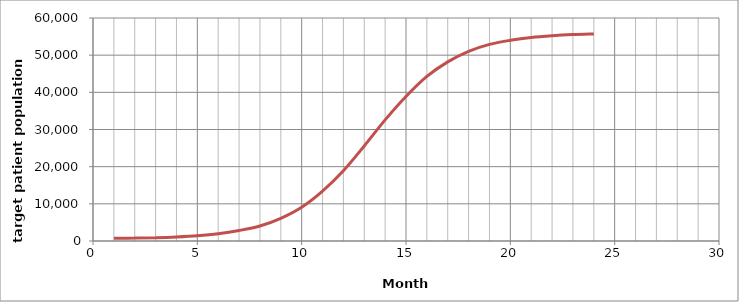
| Category | Series 1 |
|---|---|
| 0 | 712509.951 |
| 1 | 787032.405 |
| 2 | 905601.748 |
| 3 | 1106848.613 |
| 4 | 1425135.712 |
| 5 | 1960063.722 |
| 6 | 2827625.554 |
| 7 | 4048637.344 |
| 8 | 6112562.068 |
| 9 | 9088223.275 |
| 10 | 13423726.994 |
| 11 | 18898365.148 |
| 12 | 25576769.924 |
| 13 | 32590928.596 |
| 14 | 38889453.347 |
| 15 | 44275147.447 |
| 16 | 48196716.547 |
| 17 | 51032902.931 |
| 18 | 52905272.321 |
| 19 | 54005790.092 |
| 20 | 54784524.845 |
| 21 | 55251315.545 |
| 22 | 55547793.558 |
| 23 | 55722957.514 |
| 24 | 0 |
| 25 | 0 |
| 26 | 0 |
| 27 | 0 |
| 28 | 0 |
| 29 | 0 |
| 30 | 0 |
| 31 | 0 |
| 32 | 0 |
| 33 | 0 |
| 34 | 0 |
| 35 | 0 |
| 36 | 0 |
| 37 | 0 |
| 38 | 0 |
| 39 | 0 |
| 40 | 0 |
| 41 | 0 |
| 42 | 0 |
| 43 | 0 |
| 44 | 0 |
| 45 | 0 |
| 46 | 0 |
| 47 | 0 |
| 48 | 0 |
| 49 | 0 |
| 50 | 0 |
| 51 | 0 |
| 52 | 0 |
| 53 | 0 |
| 54 | 0 |
| 55 | 0 |
| 56 | 0 |
| 57 | 0 |
| 58 | 0 |
| 59 | 0 |
| 60 | 0 |
| 61 | 0 |
| 62 | 0 |
| 63 | 0 |
| 64 | 0 |
| 65 | 0 |
| 66 | 0 |
| 67 | 0 |
| 68 | 0 |
| 69 | 0 |
| 70 | 0 |
| 71 | 0 |
| 72 | 0 |
| 73 | 0 |
| 74 | 0 |
| 75 | 0 |
| 76 | 0 |
| 77 | 0 |
| 78 | 0 |
| 79 | 0 |
| 80 | 0 |
| 81 | 0 |
| 82 | 0 |
| 83 | 0 |
| 84 | 0 |
| 85 | 0 |
| 86 | 0 |
| 87 | 0 |
| 88 | 0 |
| 89 | 0 |
| 90 | 0 |
| 91 | 0 |
| 92 | 0 |
| 93 | 0 |
| 94 | 0 |
| 95 | 0 |
| 96 | 0 |
| 97 | 0 |
| 98 | 0 |
| 99 | 0 |
| 100 | 0 |
| 101 | 0 |
| 102 | 0 |
| 103 | 0 |
| 104 | 0 |
| 105 | 0 |
| 106 | 0 |
| 107 | 0 |
| 108 | 0 |
| 109 | 0 |
| 110 | 0 |
| 111 | 0 |
| 112 | 0 |
| 113 | 0 |
| 114 | 0 |
| 115 | 0 |
| 116 | 0 |
| 117 | 0 |
| 118 | 0 |
| 119 | 0 |
| 120 | 0 |
| 121 | 0 |
| 122 | 0 |
| 123 | 0 |
| 124 | 0 |
| 125 | 0 |
| 126 | 0 |
| 127 | 0 |
| 128 | 0 |
| 129 | 0 |
| 130 | 0 |
| 131 | 0 |
| 132 | 0 |
| 133 | 0 |
| 134 | 0 |
| 135 | 0 |
| 136 | 0 |
| 137 | 0 |
| 138 | 0 |
| 139 | 0 |
| 140 | 0 |
| 141 | 0 |
| 142 | 0 |
| 143 | 0 |
| 144 | 0 |
| 145 | 0 |
| 146 | 0 |
| 147 | 0 |
| 148 | 0 |
| 149 | 0 |
| 150 | 0 |
| 151 | 0 |
| 152 | 0 |
| 153 | 0 |
| 154 | 0 |
| 155 | 0 |
| 156 | 0 |
| 157 | 0 |
| 158 | 0 |
| 159 | 0 |
| 160 | 0 |
| 161 | 0 |
| 162 | 0 |
| 163 | 0 |
| 164 | 0 |
| 165 | 0 |
| 166 | 0 |
| 167 | 0 |
| 168 | 0 |
| 169 | 0 |
| 170 | 0 |
| 171 | 0 |
| 172 | 0 |
| 173 | 0 |
| 174 | 0 |
| 175 | 0 |
| 176 | 0 |
| 177 | 0 |
| 178 | 0 |
| 179 | 0 |
| 180 | 0 |
| 181 | 0 |
| 182 | 0 |
| 183 | 0 |
| 184 | 0 |
| 185 | 0 |
| 186 | 0 |
| 187 | 0 |
| 188 | 0 |
| 189 | 0 |
| 190 | 0 |
| 191 | 0 |
| 192 | 0 |
| 193 | 0 |
| 194 | 0 |
| 195 | 0 |
| 196 | 0 |
| 197 | 0 |
| 198 | 0 |
| 199 | 0 |
| 200 | 0 |
| 201 | 0 |
| 202 | 0 |
| 203 | 0 |
| 204 | 0 |
| 205 | 0 |
| 206 | 0 |
| 207 | 0 |
| 208 | 0 |
| 209 | 0 |
| 210 | 0 |
| 211 | 0 |
| 212 | 0 |
| 213 | 0 |
| 214 | 0 |
| 215 | 0 |
| 216 | 0 |
| 217 | 0 |
| 218 | 0 |
| 219 | 0 |
| 220 | 0 |
| 221 | 0 |
| 222 | 0 |
| 223 | 0 |
| 224 | 0 |
| 225 | 0 |
| 226 | 0 |
| 227 | 0 |
| 228 | 0 |
| 229 | 0 |
| 230 | 0 |
| 231 | 0 |
| 232 | 0 |
| 233 | 0 |
| 234 | 0 |
| 235 | 0 |
| 236 | 0 |
| 237 | 0 |
| 238 | 0 |
| 239 | 0 |
| 240 | 0 |
| 241 | 0 |
| 242 | 0 |
| 243 | 0 |
| 244 | 0 |
| 245 | 0 |
| 246 | 0 |
| 247 | 0 |
| 248 | 0 |
| 249 | 0 |
| 250 | 0 |
| 251 | 0 |
| 252 | 0 |
| 253 | 0 |
| 254 | 0 |
| 255 | 0 |
| 256 | 0 |
| 257 | 0 |
| 258 | 0 |
| 259 | 0 |
| 260 | 0 |
| 261 | 0 |
| 262 | 0 |
| 263 | 0 |
| 264 | 0 |
| 265 | 0 |
| 266 | 0 |
| 267 | 0 |
| 268 | 0 |
| 269 | 0 |
| 270 | 0 |
| 271 | 0 |
| 272 | 0 |
| 273 | 0 |
| 274 | 0 |
| 275 | 0 |
| 276 | 0 |
| 277 | 0 |
| 278 | 0 |
| 279 | 0 |
| 280 | 0 |
| 281 | 0 |
| 282 | 0 |
| 283 | 0 |
| 284 | 0 |
| 285 | 0 |
| 286 | 0 |
| 287 | 0 |
| 288 | 0 |
| 289 | 0 |
| 290 | 0 |
| 291 | 0 |
| 292 | 0 |
| 293 | 0 |
| 294 | 0 |
| 295 | 0 |
| 296 | 0 |
| 297 | 0 |
| 298 | 0 |
| 299 | 0 |
| 300 | 0 |
| 301 | 0 |
| 302 | 0 |
| 303 | 0 |
| 304 | 0 |
| 305 | 0 |
| 306 | 0 |
| 307 | 0 |
| 308 | 0 |
| 309 | 0 |
| 310 | 0 |
| 311 | 0 |
| 312 | 0 |
| 313 | 0 |
| 314 | 0 |
| 315 | 0 |
| 316 | 0 |
| 317 | 0 |
| 318 | 0 |
| 319 | 0 |
| 320 | 0 |
| 321 | 0 |
| 322 | 0 |
| 323 | 0 |
| 324 | 0 |
| 325 | 0 |
| 326 | 0 |
| 327 | 0 |
| 328 | 0 |
| 329 | 0 |
| 330 | 0 |
| 331 | 0 |
| 332 | 0 |
| 333 | 0 |
| 334 | 0 |
| 335 | 0 |
| 336 | 0 |
| 337 | 0 |
| 338 | 0 |
| 339 | 0 |
| 340 | 0 |
| 341 | 0 |
| 342 | 0 |
| 343 | 0 |
| 344 | 0 |
| 345 | 0 |
| 346 | 0 |
| 347 | 0 |
| 348 | 0 |
| 349 | 0 |
| 350 | 0 |
| 351 | 0 |
| 352 | 0 |
| 353 | 0 |
| 354 | 0 |
| 355 | 0 |
| 356 | 0 |
| 357 | 0 |
| 358 | 0 |
| 359 | 0 |
| 360 | 0 |
| 361 | 0 |
| 362 | 0 |
| 363 | 0 |
| 364 | 0 |
| 365 | 0 |
| 366 | 0 |
| 367 | 0 |
| 368 | 0 |
| 369 | 0 |
| 370 | 0 |
| 371 | 0 |
| 372 | 0 |
| 373 | 0 |
| 374 | 0 |
| 375 | 0 |
| 376 | 0 |
| 377 | 0 |
| 378 | 0 |
| 379 | 0 |
| 380 | 0 |
| 381 | 0 |
| 382 | 0 |
| 383 | 0 |
| 384 | 0 |
| 385 | 0 |
| 386 | 0 |
| 387 | 0 |
| 388 | 0 |
| 389 | 0 |
| 390 | 0 |
| 391 | 0 |
| 392 | 0 |
| 393 | 0 |
| 394 | 0 |
| 395 | 0 |
| 396 | 0 |
| 397 | 0 |
| 398 | 0 |
| 399 | 0 |
| 400 | 0 |
| 401 | 0 |
| 402 | 0 |
| 403 | 0 |
| 404 | 0 |
| 405 | 0 |
| 406 | 0 |
| 407 | 0 |
| 408 | 0 |
| 409 | 0 |
| 410 | 0 |
| 411 | 0 |
| 412 | 0 |
| 413 | 0 |
| 414 | 0 |
| 415 | 0 |
| 416 | 0 |
| 417 | 0 |
| 418 | 0 |
| 419 | 0 |
| 420 | 0 |
| 421 | 0 |
| 422 | 0 |
| 423 | 0 |
| 424 | 0 |
| 425 | 0 |
| 426 | 0 |
| 427 | 0 |
| 428 | 0 |
| 429 | 0 |
| 430 | 0 |
| 431 | 0 |
| 432 | 0 |
| 433 | 0 |
| 434 | 0 |
| 435 | 0 |
| 436 | 0 |
| 437 | 0 |
| 438 | 0 |
| 439 | 0 |
| 440 | 0 |
| 441 | 0 |
| 442 | 0 |
| 443 | 0 |
| 444 | 0 |
| 445 | 0 |
| 446 | 0 |
| 447 | 0 |
| 448 | 0 |
| 449 | 0 |
| 450 | 0 |
| 451 | 0 |
| 452 | 0 |
| 453 | 0 |
| 454 | 0 |
| 455 | 0 |
| 456 | 0 |
| 457 | 0 |
| 458 | 0 |
| 459 | 0 |
| 460 | 0 |
| 461 | 0 |
| 462 | 0 |
| 463 | 0 |
| 464 | 0 |
| 465 | 0 |
| 466 | 0 |
| 467 | 0 |
| 468 | 0 |
| 469 | 0 |
| 470 | 0 |
| 471 | 0 |
| 472 | 0 |
| 473 | 0 |
| 474 | 0 |
| 475 | 0 |
| 476 | 0 |
| 477 | 0 |
| 478 | 0 |
| 479 | 0 |
| 480 | 0 |
| 481 | 0 |
| 482 | 0 |
| 483 | 0 |
| 484 | 0 |
| 485 | 0 |
| 486 | 0 |
| 487 | 0 |
| 488 | 0 |
| 489 | 0 |
| 490 | 0 |
| 491 | 0 |
| 492 | 0 |
| 493 | 0 |
| 494 | 0 |
| 495 | 0 |
| 496 | 0 |
| 497 | 0 |
| 498 | 0 |
| 499 | 0 |
| 500 | 0 |
| 501 | 0 |
| 502 | 0 |
| 503 | 0 |
| 504 | 0 |
| 505 | 0 |
| 506 | 0 |
| 507 | 0 |
| 508 | 0 |
| 509 | 0 |
| 510 | 0 |
| 511 | 0 |
| 512 | 0 |
| 513 | 0 |
| 514 | 0 |
| 515 | 0 |
| 516 | 0 |
| 517 | 0 |
| 518 | 0 |
| 519 | 0 |
| 520 | 0 |
| 521 | 0 |
| 522 | 0 |
| 523 | 0 |
| 524 | 0 |
| 525 | 0 |
| 526 | 0 |
| 527 | 0 |
| 528 | 0 |
| 529 | 0 |
| 530 | 0 |
| 531 | 0 |
| 532 | 0 |
| 533 | 0 |
| 534 | 0 |
| 535 | 0 |
| 536 | 0 |
| 537 | 0 |
| 538 | 0 |
| 539 | 0 |
| 540 | 0 |
| 541 | 0 |
| 542 | 0 |
| 543 | 0 |
| 544 | 0 |
| 545 | 0 |
| 546 | 0 |
| 547 | 0 |
| 548 | 0 |
| 549 | 0 |
| 550 | 0 |
| 551 | 0 |
| 552 | 0 |
| 553 | 0 |
| 554 | 0 |
| 555 | 0 |
| 556 | 0 |
| 557 | 0 |
| 558 | 0 |
| 559 | 0 |
| 560 | 0 |
| 561 | 0 |
| 562 | 0 |
| 563 | 0 |
| 564 | 0 |
| 565 | 0 |
| 566 | 0 |
| 567 | 0 |
| 568 | 0 |
| 569 | 0 |
| 570 | 0 |
| 571 | 0 |
| 572 | 0 |
| 573 | 0 |
| 574 | 0 |
| 575 | 0 |
| 576 | 0 |
| 577 | 0 |
| 578 | 0 |
| 579 | 0 |
| 580 | 0 |
| 581 | 0 |
| 582 | 0 |
| 583 | 0 |
| 584 | 0 |
| 585 | 0 |
| 586 | 0 |
| 587 | 0 |
| 588 | 0 |
| 589 | 0 |
| 590 | 0 |
| 591 | 0 |
| 592 | 0 |
| 593 | 0 |
| 594 | 0 |
| 595 | 0 |
| 596 | 0 |
| 597 | 0 |
| 598 | 0 |
| 599 | 0 |
| 600 | 0 |
| 601 | 0 |
| 602 | 0 |
| 603 | 0 |
| 604 | 0 |
| 605 | 0 |
| 606 | 0 |
| 607 | 0 |
| 608 | 0 |
| 609 | 0 |
| 610 | 0 |
| 611 | 0 |
| 612 | 0 |
| 613 | 0 |
| 614 | 0 |
| 615 | 0 |
| 616 | 0 |
| 617 | 0 |
| 618 | 0 |
| 619 | 0 |
| 620 | 0 |
| 621 | 0 |
| 622 | 0 |
| 623 | 0 |
| 624 | 0 |
| 625 | 0 |
| 626 | 0 |
| 627 | 0 |
| 628 | 0 |
| 629 | 0 |
| 630 | 0 |
| 631 | 0 |
| 632 | 0 |
| 633 | 0 |
| 634 | 0 |
| 635 | 0 |
| 636 | 0 |
| 637 | 0 |
| 638 | 0 |
| 639 | 0 |
| 640 | 0 |
| 641 | 0 |
| 642 | 0 |
| 643 | 0 |
| 644 | 0 |
| 645 | 0 |
| 646 | 0 |
| 647 | 0 |
| 648 | 0 |
| 649 | 0 |
| 650 | 0 |
| 651 | 0 |
| 652 | 0 |
| 653 | 0 |
| 654 | 0 |
| 655 | 0 |
| 656 | 0 |
| 657 | 0 |
| 658 | 0 |
| 659 | 0 |
| 660 | 0 |
| 661 | 0 |
| 662 | 0 |
| 663 | 0 |
| 664 | 0 |
| 665 | 0 |
| 666 | 0 |
| 667 | 0 |
| 668 | 0 |
| 669 | 0 |
| 670 | 0 |
| 671 | 0 |
| 672 | 0 |
| 673 | 0 |
| 674 | 0 |
| 675 | 0 |
| 676 | 0 |
| 677 | 0 |
| 678 | 0 |
| 679 | 0 |
| 680 | 0 |
| 681 | 0 |
| 682 | 0 |
| 683 | 0 |
| 684 | 0 |
| 685 | 0 |
| 686 | 0 |
| 687 | 0 |
| 688 | 0 |
| 689 | 0 |
| 690 | 0 |
| 691 | 0 |
| 692 | 0 |
| 693 | 0 |
| 694 | 0 |
| 695 | 0 |
| 696 | 0 |